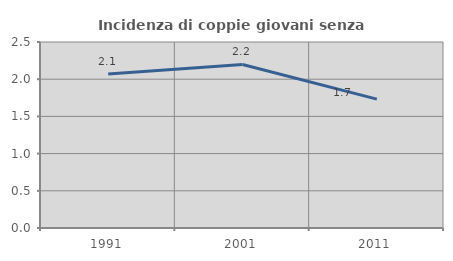
| Category | Incidenza di coppie giovani senza figli |
|---|---|
| 1991.0 | 2.069 |
| 2001.0 | 2.198 |
| 2011.0 | 1.732 |